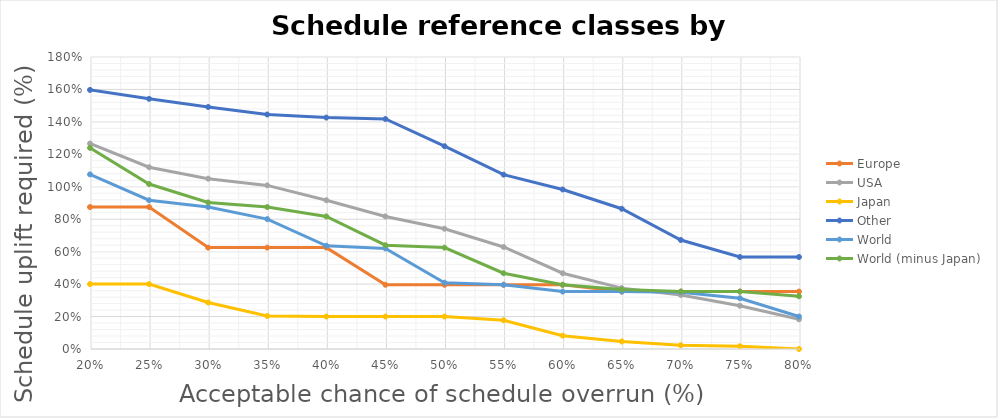
| Category | Europe | USA | Japan | Other | World | World (minus Japan) |
|---|---|---|---|---|---|---|
| 0.8 | 0.354 | 0.183 | 0 | 0.567 | 0.2 | 0.325 |
| 0.75 | 0.354 | 0.266 | 0.017 | 0.567 | 0.313 | 0.354 |
| 0.7 | 0.354 | 0.333 | 0.023 | 0.672 | 0.35 | 0.354 |
| 0.65 | 0.354 | 0.375 | 0.047 | 0.864 | 0.354 | 0.367 |
| 0.6 | 0.396 | 0.467 | 0.082 | 0.983 | 0.354 | 0.396 |
| 0.55 | 0.396 | 0.629 | 0.177 | 1.075 | 0.396 | 0.467 |
| 0.5 | 0.396 | 0.742 | 0.2 | 1.25 | 0.409 | 0.625 |
| 0.45 | 0.396 | 0.817 | 0.2 | 1.418 | 0.62 | 0.64 |
| 0.399999999999999 | 0.625 | 0.917 | 0.2 | 1.427 | 0.636 | 0.817 |
| 0.349999999999999 | 0.625 | 1.008 | 0.203 | 1.446 | 0.801 | 0.875 |
| 0.299999999999999 | 0.625 | 1.05 | 0.287 | 1.492 | 0.875 | 0.903 |
| 0.249999999999999 | 0.875 | 1.121 | 0.4 | 1.542 | 0.917 | 1.017 |
| 0.199999999999999 | 0.875 | 1.267 | 0.4 | 1.597 | 1.077 | 1.24 |